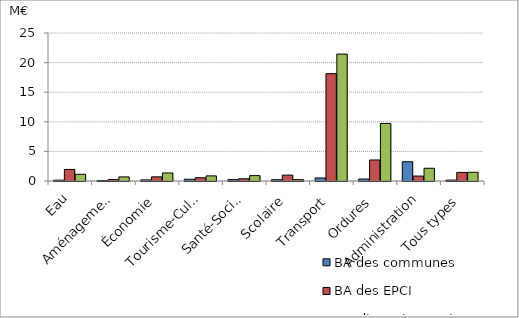
| Category | BA des communes | BA des EPCI | Syndicats à vocation unique |
|---|---|---|---|
| Eau | 0.145 | 1.953 | 1.134 |
| Aménagement de Zones, Lotissement, Ateliers | 0.07 | 0.233 | 0.694 |
| Économie | 0.182 | 0.701 | 1.36 |
| Tourisme-Culture-Sport | 0.295 | 0.552 | 0.862 |
| Santé-Social | 0.225 | 0.375 | 0.908 |
| Scolaire | 0.22 | 0.994 | 0.231 |
| Transport | 0.51 | 18.125 | 21.438 |
| Ordures | 0.331 | 3.55 | 9.717 |
| Administration | 3.252 | 0.835 | 2.153 |
| Tous types | 0.15 | 1.447 | 1.47 |